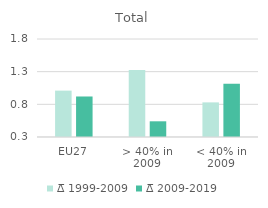
| Category | ∆̅ 1999-2009 | ∆̅ 2009-2019 |
|---|---|---|
| EU27 | 1.01 | 0.92 |
| > 40% in 2009 | 1.326 | 0.54 |
| < 40% in 2009 | 0.83 | 1.117 |